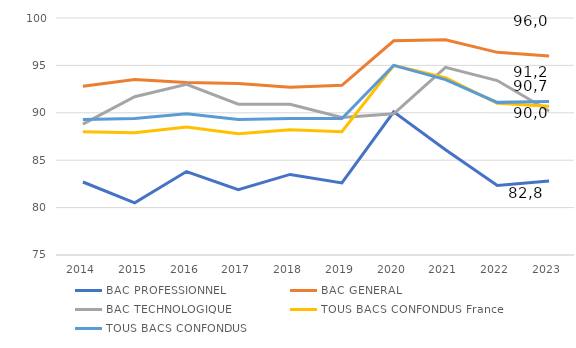
| Category | BAC PROFESSIONNEL | BAC GENERAL | BAC TECHNOLOGIQUE | TOUS BACS CONFONDUS France | TOUS BACS CONFONDUS |
|---|---|---|---|---|---|
| 2014 | 82.7 | 92.8 | 88.8 | 88 | 89.3 |
| 2015 | 80.5 | 93.5 | 91.7 | 87.9 | 89.4 |
| 2016 | 83.8 | 93.2 | 93 | 88.5 | 89.9 |
| 2017 | 81.9 | 93.1 | 90.9 | 87.8 | 89.3 |
| 2018 | 83.5 | 92.7 | 90.9 | 88.2 | 89.4 |
| 2019 | 82.6 | 92.9 | 89.5 | 88 | 89.4 |
| 2020 | 90.1 | 97.6 | 89.9 | 95 | 95 |
| 2021 | 86.1 | 97.7 | 94.8 | 93.7 | 93.5 |
| 2022 | 82.334 | 96.377 | 93.4 | 91 | 91.1 |
| 2023 | 82.8 | 96 | 90.198 | 90.7 | 91.2 |